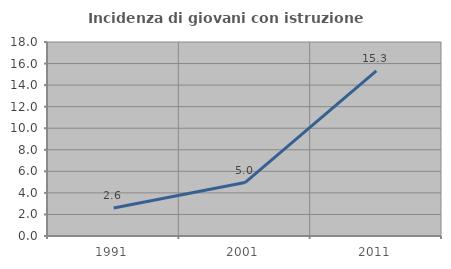
| Category | Incidenza di giovani con istruzione universitaria |
|---|---|
| 1991.0 | 2.597 |
| 2001.0 | 4.955 |
| 2011.0 | 15.319 |